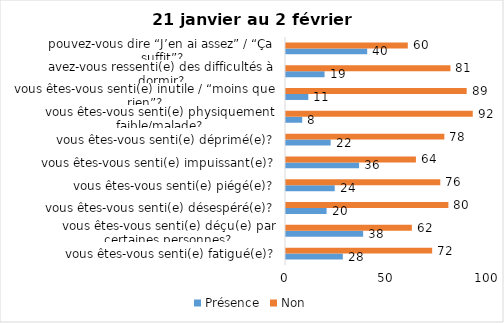
| Category | Présence | Non |
|---|---|---|
| vous êtes-vous senti(e) fatigué(e)? | 28 | 72 |
| vous êtes-vous senti(e) déçu(e) par certaines personnes? | 38 | 62 |
| vous êtes-vous senti(e) désespéré(e)? | 20 | 80 |
| vous êtes-vous senti(e) piégé(e)? | 24 | 76 |
| vous êtes-vous senti(e) impuissant(e)? | 36 | 64 |
| vous êtes-vous senti(e) déprimé(e)? | 22 | 78 |
| vous êtes-vous senti(e) physiquement faible/malade? | 8 | 92 |
| vous êtes-vous senti(e) inutile / “moins que rien”? | 11 | 89 |
| avez-vous ressenti(e) des difficultés à dormir? | 19 | 81 |
| pouvez-vous dire “J’en ai assez” / “Ça suffit”? | 40 | 60 |